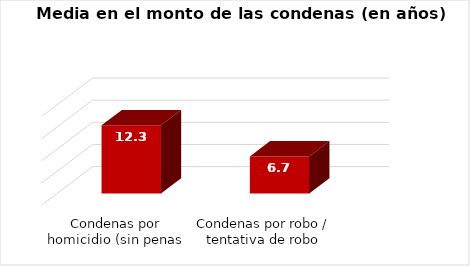
| Category | Series 0 |
|---|---|
| Condenas por homicidio (sin penas perpetuas) | 12.3 |
| Condenas por robo / tentativa de robo | 6.7 |